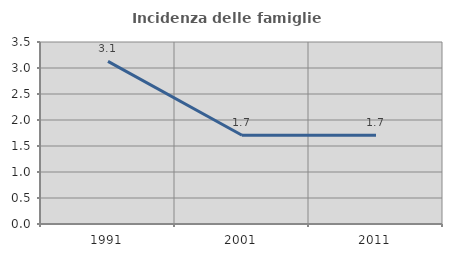
| Category | Incidenza delle famiglie numerose |
|---|---|
| 1991.0 | 3.128 |
| 2001.0 | 1.706 |
| 2011.0 | 1.705 |